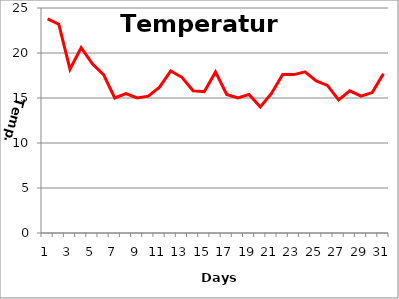
| Category | Series 0 |
|---|---|
| 0 | 23.8 |
| 1 | 23.2 |
| 2 | 18.2 |
| 3 | 20.6 |
| 4 | 18.8 |
| 5 | 17.6 |
| 6 | 15 |
| 7 | 15.5 |
| 8 | 15 |
| 9 | 15.2 |
| 10 | 16.2 |
| 11 | 18 |
| 12 | 17.3 |
| 13 | 15.8 |
| 14 | 15.7 |
| 15 | 17.9 |
| 16 | 15.4 |
| 17 | 15 |
| 18 | 15.4 |
| 19 | 14 |
| 20 | 15.5 |
| 21 | 17.6 |
| 22 | 17.6 |
| 23 | 17.9 |
| 24 | 16.9 |
| 25 | 16.4 |
| 26 | 14.8 |
| 27 | 15.8 |
| 28 | 15.2 |
| 29 | 15.6 |
| 30 | 17.7 |